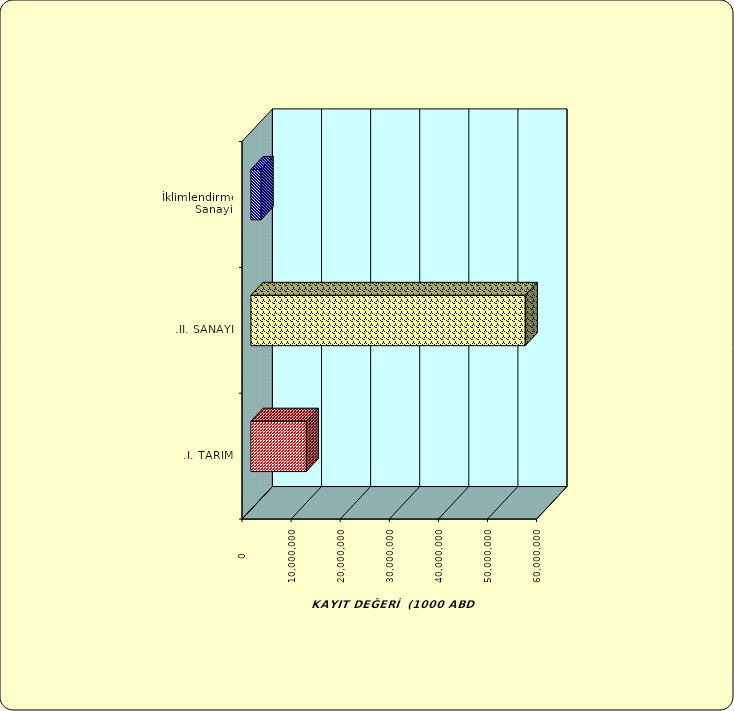
| Category | Series 0 |
|---|---|
| .I. TARIM | 11282129.463 |
| .II. SANAYİ | 55884066 |
|  İklimlendirme Sanayii | 2070727.689 |